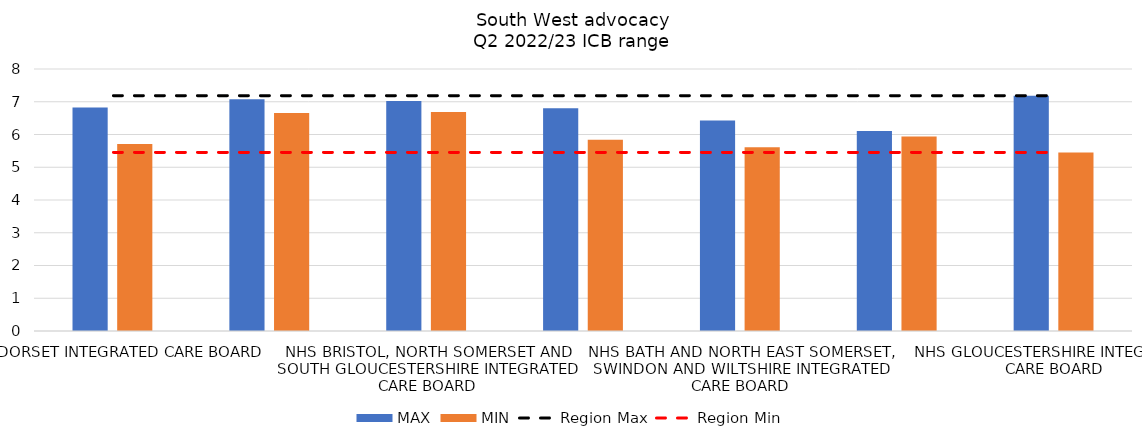
| Category | MAX | MIN |
|---|---|---|
| NHS DORSET INTEGRATED CARE BOARD | 6.823 | 5.708 |
| NHS SOMERSET INTEGRATED CARE BOARD | 7.075 | 6.656 |
| NHS BRISTOL, NORTH SOMERSET AND SOUTH GLOUCESTERSHIRE INTEGRATED CARE BOARD | 7.022 | 6.686 |
| NHS DEVON INTEGRATED CARE BOARD | 6.805 | 5.841 |
| NHS BATH AND NORTH EAST SOMERSET, SWINDON AND WILTSHIRE INTEGRATED CARE BOARD | 6.424 | 5.608 |
| NHS CORNWALL AND THE ISLES OF SCILLY INTEGRATED CARE BOARD | 6.109 | 5.938 |
| NHS GLOUCESTERSHIRE INTEGRATED CARE BOARD | 7.186 | 5.454 |